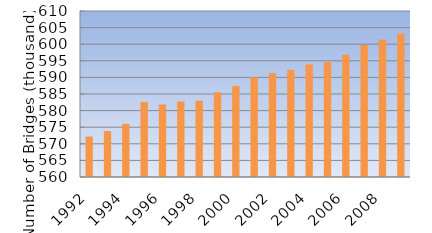
| Category | Total Bridges (thousand) |
|---|---|
| 1992.0 | 572.196 |
| 1993.0 | 573.846 |
| 1994.0 | 575.988 |
| 1995.0 | 582.568 |
| 1996.0 | 581.862 |
| 1997.0 | 582.751 |
| 1998.0 | 582.984 |
| 1999.0 | 585.542 |
| 2000.0 | 587.458 |
| 2001.0 | 590.066 |
| 2002.0 | 591.22 |
| 2003.0 | 592.246 |
| 2004.0 | 593.885 |
| 2005.0 | 594.616 |
| 2006.0 | 596.842 |
| 2007.0 | 599.766 |
| 2008.0 | 601.411 |
| 2009.0 | 603.254 |